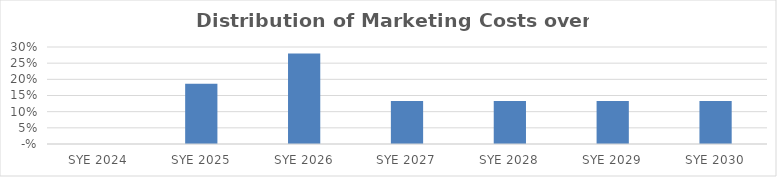
| Category | Series 0 |
|---|---|
| 2024.0 | 0 |
| 2025.0 | 0.187 |
| 2026.0 | 0.28 |
| 2027.0 | 0.133 |
| 2028.0 | 0.133 |
| 2029.0 | 0.133 |
| 2030.0 | 0.133 |